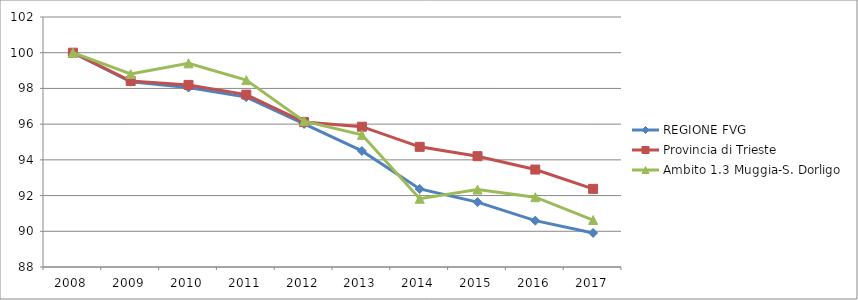
| Category | REGIONE FVG | Provincia di Trieste | Ambito 1.3 Muggia-S. Dorligo |
|---|---|---|---|
| 2008.0 | 100 | 100 | 100 |
| 2009.0 | 98.378 | 98.416 | 98.807 |
| 2010.0 | 98.049 | 98.197 | 99.404 |
| 2011.0 | 97.515 | 97.653 | 98.467 |
| 2012.0 | 96.012 | 96.115 | 96.167 |
| 2013.0 | 94.5 | 95.857 | 95.4 |
| 2014.0 | 92.37 | 94.73 | 91.823 |
| 2015.0 | 91.632 | 94.206 | 92.334 |
| 2016.0 | 90.595 | 93.457 | 91.908 |
| 2017.0 | 89.908 | 92.376 | 90.63 |